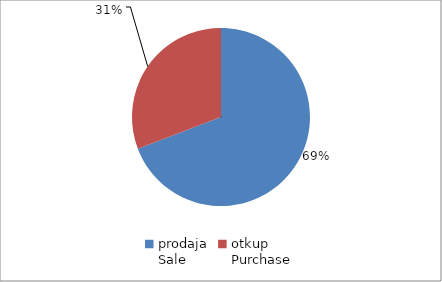
| Category | Series 0 |
|---|---|
| prodaja
Sale | 17891622.83 |
| otkup
Purchase | 7961465.56 |